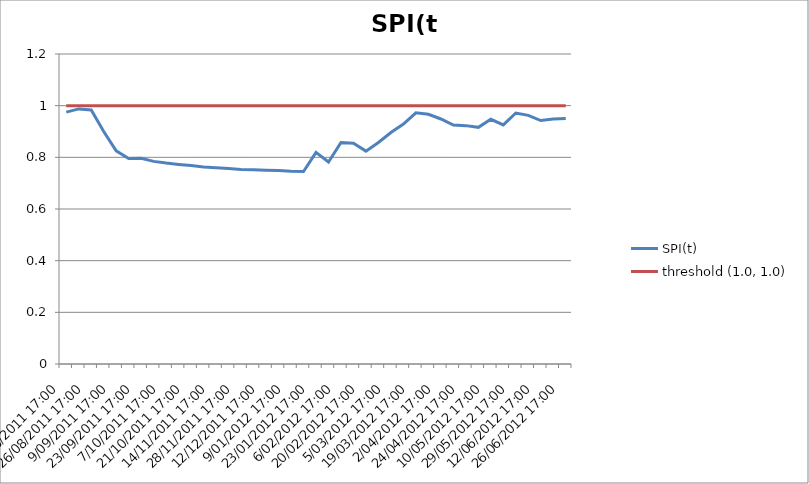
| Category | SPI(t) | threshold (1.0, 1.0) |
|---|---|---|
| 11/08/2011 17:00 | 0.975 | 1 |
| 19/08/2011 17:00 | 0.988 | 1 |
| 26/08/2011 17:00 | 0.983 | 1 |
| 2/09/2011 17:00 | 0.9 | 1 |
| 9/09/2011 17:00 | 0.825 | 1 |
| 16/09/2011 17:00 | 0.796 | 1 |
| 23/09/2011 17:00 | 0.796 | 1 |
| 30/09/2011 17:00 | 0.784 | 1 |
| 7/10/2011 17:00 | 0.778 | 1 |
| 14/10/2011 17:00 | 0.772 | 1 |
| 21/10/2011 17:00 | 0.768 | 1 |
| 28/10/2011 17:00 | 0.762 | 1 |
| 14/11/2011 17:00 | 0.76 | 1 |
| 21/11/2011 17:00 | 0.757 | 1 |
| 28/11/2011 17:00 | 0.753 | 1 |
| 5/12/2011 17:00 | 0.752 | 1 |
| 12/12/2011 17:00 | 0.75 | 1 |
| 19/12/2011 17:00 | 0.749 | 1 |
| 9/01/2012 17:00 | 0.746 | 1 |
| 16/01/2012 17:00 | 0.745 | 1 |
| 23/01/2012 17:00 | 0.819 | 1 |
| 30/01/2012 17:00 | 0.782 | 1 |
| 6/02/2012 17:00 | 0.858 | 1 |
| 13/02/2012 17:00 | 0.854 | 1 |
| 20/02/2012 17:00 | 0.824 | 1 |
| 27/02/2012 17:00 | 0.858 | 1 |
| 5/03/2012 17:00 | 0.896 | 1 |
| 12/03/2012 17:00 | 0.929 | 1 |
| 19/03/2012 17:00 | 0.972 | 1 |
| 26/03/2012 17:00 | 0.967 | 1 |
| 2/04/2012 17:00 | 0.948 | 1 |
| 17/04/2012 17:00 | 0.925 | 1 |
| 24/04/2012 17:00 | 0.923 | 1 |
| 3/05/2012 17:00 | 0.916 | 1 |
| 10/05/2012 17:00 | 0.947 | 1 |
| 21/05/2012 17:00 | 0.926 | 1 |
| 29/05/2012 17:00 | 0.972 | 1 |
| 5/06/2012 17:00 | 0.962 | 1 |
| 12/06/2012 17:00 | 0.942 | 1 |
| 19/06/2012 17:00 | 0.949 | 1 |
| 26/06/2012 17:00 | 0.95 | 1 |